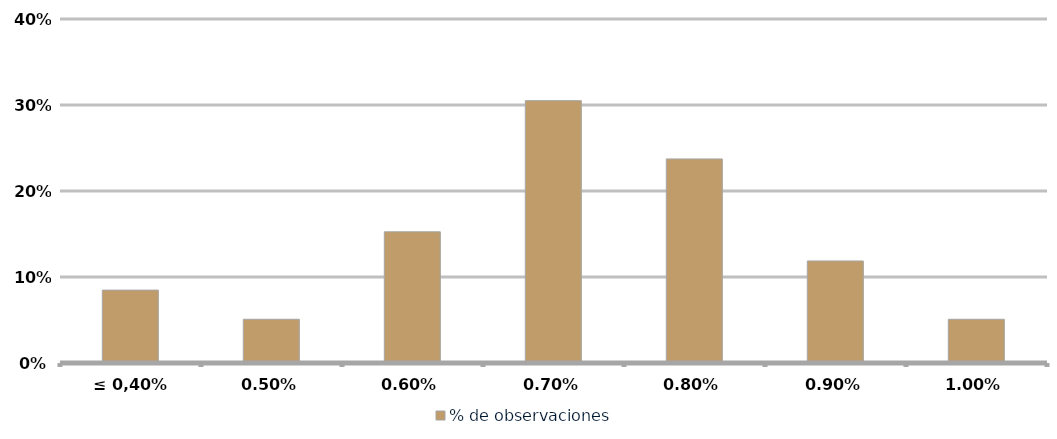
| Category | % de observaciones  |
|---|---|
| ≤ 0,40% | 0.085 |
| 0,50% | 0.051 |
| 0,60% | 0.153 |
| 0,70% | 0.305 |
| 0,80% | 0.237 |
| 0,90% | 0.119 |
| 1,00% | 0.051 |